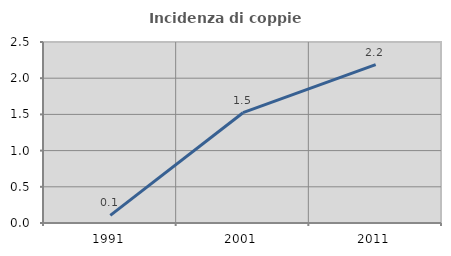
| Category | Incidenza di coppie miste |
|---|---|
| 1991.0 | 0.105 |
| 2001.0 | 1.523 |
| 2011.0 | 2.187 |